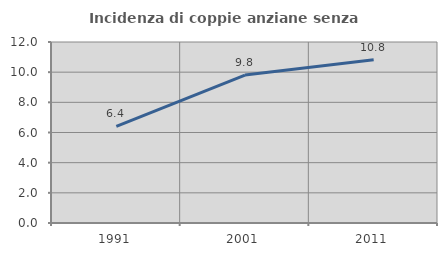
| Category | Incidenza di coppie anziane senza figli  |
|---|---|
| 1991.0 | 6.406 |
| 2001.0 | 9.81 |
| 2011.0 | 10.819 |